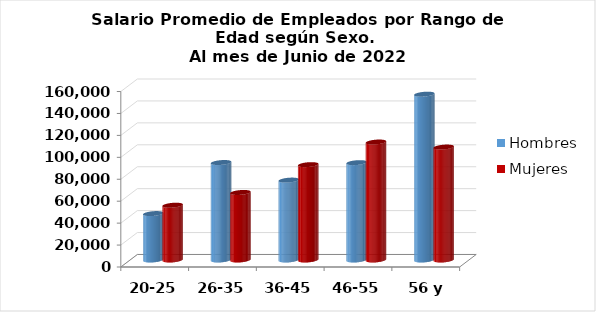
| Category | Hombres | Mujeres |
|---|---|---|
| 20-25 | 42325 | 49950.75 |
| 26-35 | 88881.033 | 61586.076 |
| 36-45 | 72846.147 | 86951.483 |
| 46-55 | 88775 | 107558.542 |
| 56 y más | 151208.696 | 102971.52 |